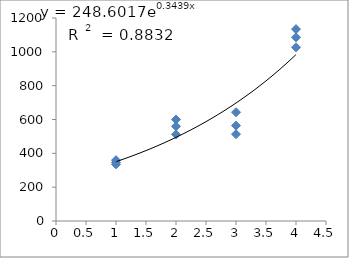
| Category | Series 0 |
|---|---|
| 1.0 | 335.182 |
| 1.0 | 345.657 |
| 1.0 | 359.623 |
| 2.0 | 559.65 |
| 2.0 | 512.098 |
| 2.0 | 599.886 |
| 3.0 | 642.845 |
| 3.0 | 563.899 |
| 3.0 | 513.148 |
| 4.0 | 1134.418 |
| 4.0 | 1026.543 |
| 4.0 | 1085.7 |